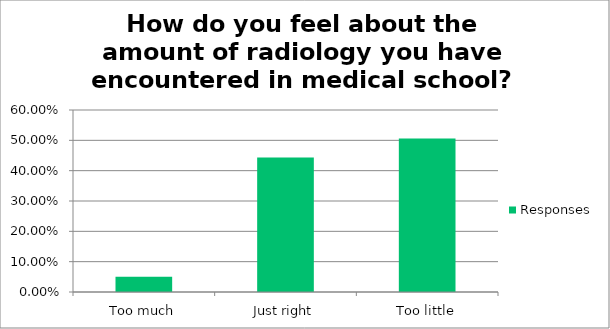
| Category | Responses |
|---|---|
| Too much | 0.051 |
| Just right | 0.443 |
| Too little | 0.506 |